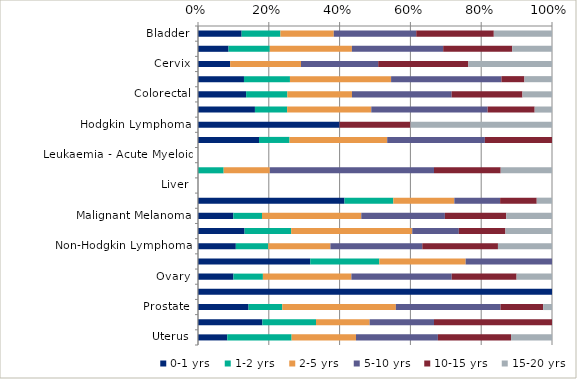
| Category | 0-1 yrs | 1-2 yrs | 2-5 yrs | 5-10 yrs | 10-15 yrs | 15-20 yrs |
|---|---|---|---|---|---|---|
| Bladder | 0.123 | 0.11 | 0.151 | 0.233 | 0.219 | 0.164 |
| Breast | 0.086 | 0.117 | 0.232 | 0.258 | 0.195 | 0.112 |
| Cervix | 0.091 | 0 | 0.2 | 0.218 | 0.255 | 0.236 |
| Central Nervous System (including Brain) | 0.13 | 0.13 | 0.286 | 0.312 | 0.065 | 0.078 |
| Colorectal | 0.136 | 0.117 | 0.183 | 0.282 | 0.2 | 0.083 |
| Head and Neck | 0.161 | 0.091 | 0.238 | 0.329 | 0.133 | 0.049 |
| Hodgkin Lymphoma | 0.4 | 0 | 0 | 0 | 0.2 | 0.4 |
| Kidney and unspecified urinary organs | 0.172 | 0.086 | 0.276 | 0.276 | 0.19 | 0 |
| Leukaemia - Acute Myeloid | 0 | 0 | 0 | 0 | 0 | 0 |
| Leukaemia - Chronic Lymphocytic | 0 | 0.072 | 0.13 | 0.464 | 0.188 | 0.145 |
| Liver | 0 | 0 | 0 | 0 | 0 | 0 |
| Lung | 0.414 | 0.138 | 0.172 | 0.129 | 0.103 | 0.043 |
| Malignant Melanoma | 0.1 | 0.081 | 0.28 | 0.236 | 0.173 | 0.129 |
| Multiple Myeloma | 0.132 | 0.132 | 0.342 | 0.132 | 0.132 | 0.132 |
| Non-Hodgkin Lymphoma | 0.107 | 0.092 | 0.176 | 0.26 | 0.214 | 0.153 |
| Oesophagus | 0.317 | 0.195 | 0.244 | 0.244 | 0 | 0 |
| Ovary | 0.1 | 0.083 | 0.25 | 0.283 | 0.183 | 0.1 |
| Pancreas | 1 | 0 | 0 | 0 | 0 | 0 |
| Prostate | 0.143 | 0.095 | 0.321 | 0.296 | 0.12 | 0.025 |
| Stomach | 0.182 | 0.152 | 0.152 | 0.182 | 0.333 | 0 |
| Uterus | 0.083 | 0.182 | 0.182 | 0.231 | 0.207 | 0.116 |